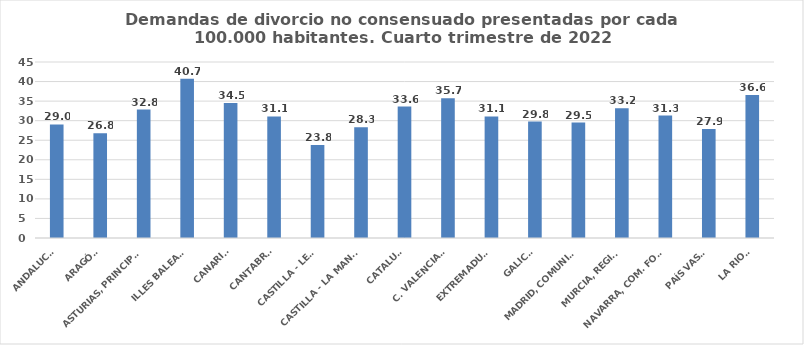
| Category | Series 0 |
|---|---|
| ANDALUCÍA | 29.036 |
| ARAGÓN | 26.766 |
| ASTURIAS, PRINCIPADO | 32.846 |
| ILLES BALEARS | 40.708 |
| CANARIAS | 34.486 |
| CANTABRIA | 31.09 |
| CASTILLA - LEÓN | 23.771 |
| CASTILLA - LA MANCHA | 28.296 |
| CATALUÑA | 33.609 |
| C. VALENCIANA | 35.74 |
| EXTREMADURA | 31.097 |
| GALICIA | 29.772 |
| MADRID, COMUNIDAD | 29.51 |
| MURCIA, REGIÓN | 33.162 |
| NAVARRA, COM. FORAL | 31.32 |
| PAÍS VASCO | 27.851 |
| LA RIOJA | 36.575 |